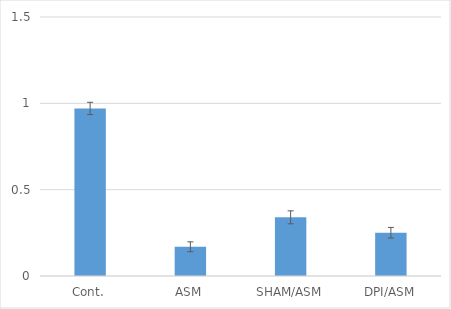
| Category | Series 0 |
|---|---|
| Cont. | 0.97 |
| ASM | 0.169 |
| SHAM/ASM | 0.34 |
| DPI/ASM | 0.251 |